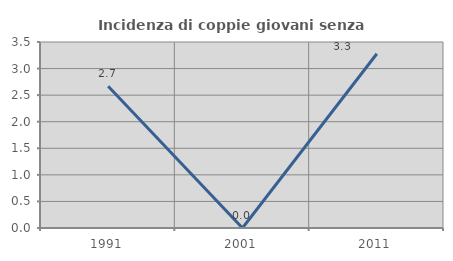
| Category | Incidenza di coppie giovani senza figli |
|---|---|
| 1991.0 | 2.667 |
| 2001.0 | 0 |
| 2011.0 | 3.279 |